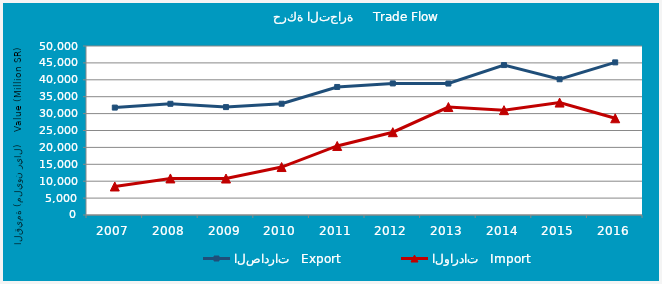
| Category | الصادرات   Export | الواردات   Import |
|---|---|---|
| 2007.0 | 31779.605 | 8436.596 |
| 2008.0 | 32899.591 | 10814.457 |
| 2009.0 | 31920.951 | 10789.742 |
| 2010.0 | 32923.101 | 14189.597 |
| 2011.0 | 37881.329 | 20425.8 |
| 2012.0 | 38927.242 | 24495.105 |
| 2013.0 | 38895.968 | 31939.59 |
| 2014.0 | 44356.175 | 31018.752 |
| 2015.0 | 40160.754 | 33264.058 |
| 2016.0 | 45154.391 | 28616.261 |